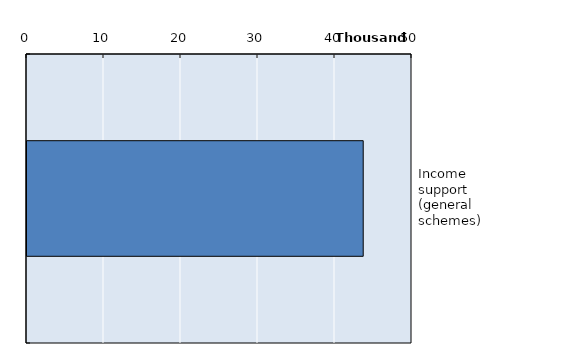
| Category | Series 0 |
|---|---|
| Income support (general schemes) | 43664 |